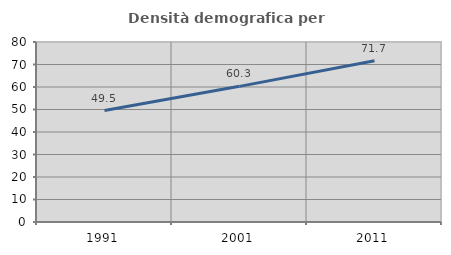
| Category | Densità demografica |
|---|---|
| 1991.0 | 49.523 |
| 2001.0 | 60.289 |
| 2011.0 | 71.708 |